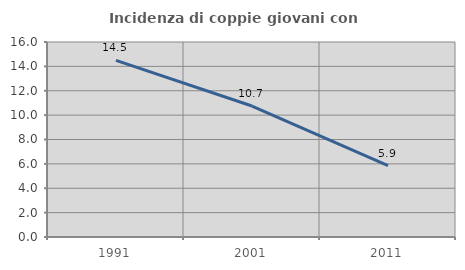
| Category | Incidenza di coppie giovani con figli |
|---|---|
| 1991.0 | 14.498 |
| 2001.0 | 10.747 |
| 2011.0 | 5.852 |